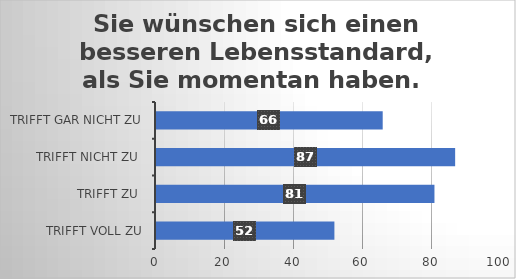
| Category | Sie wünschen sich einen besseren Lebensstandard, als Sie momentan haben.  |
|---|---|
| trifft voll zu | 52 |
| trifft zu  | 81 |
| trifft nicht zu  | 87 |
| trifft gar nicht zu | 66 |